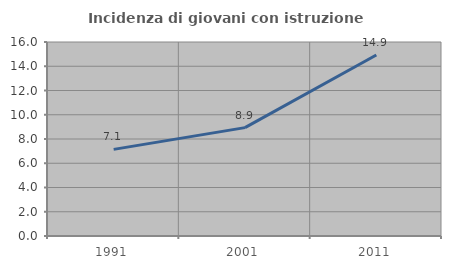
| Category | Incidenza di giovani con istruzione universitaria |
|---|---|
| 1991.0 | 7.143 |
| 2001.0 | 8.939 |
| 2011.0 | 14.925 |